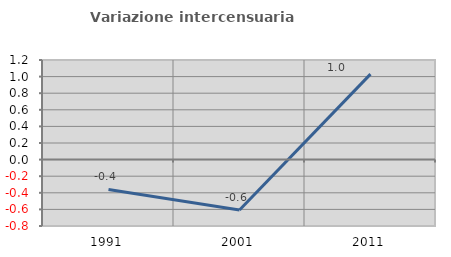
| Category | Variazione intercensuaria annua |
|---|---|
| 1991.0 | -0.36 |
| 2001.0 | -0.607 |
| 2011.0 | 1.03 |